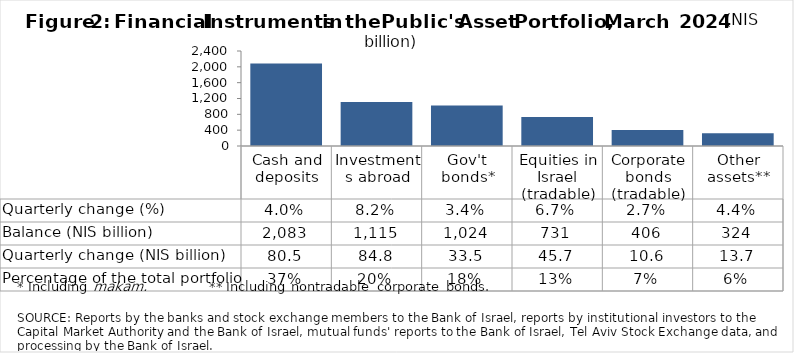
| Category | Balance (NIS billion) |
|---|---|
| Cash and deposits | 2082.79 |
| Investments abroad | 1114.6 |
| Gov't bonds* | 1023.58 |
| Equities in Israel (tradable) | 731 |
| Corporate bonds (tradable) | 405.79 |
| Other assets** | 323.68 |